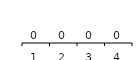
| Category | Series 0 |
|---|---|
| 1.0 | 0 |
| 2.0 | 0 |
| 3.0 | 0 |
| 4.0 | 0 |